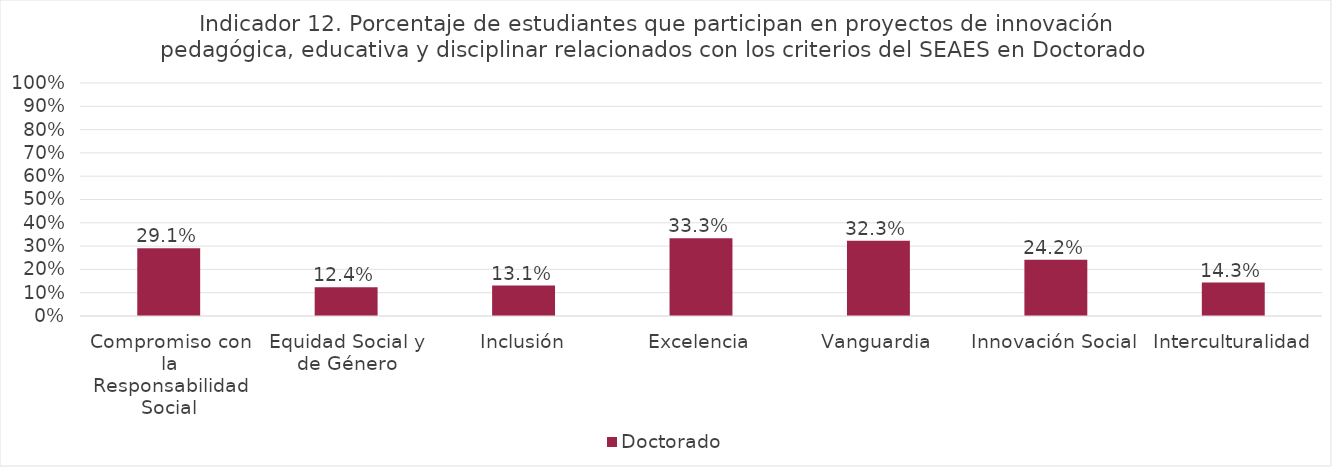
| Category | Doctorado |
|---|---|
| Compromiso con la Responsabilidad Social | 0.291 |
| Equidad Social y de Género | 0.124 |
| Inclusión | 0.131 |
| Excelencia | 0.333 |
| Vanguardia | 0.323 |
| Innovación Social | 0.242 |
| Interculturalidad | 0.143 |